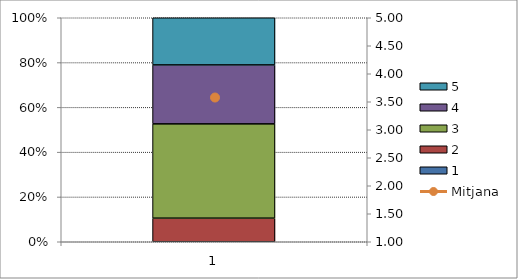
| Category | 1 | 2 | 3 | 4 | 5 |
|---|---|---|---|---|---|
| 0 | 0 | 2 | 8 | 5 | 4 |